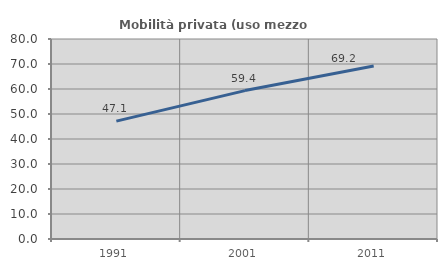
| Category | Mobilità privata (uso mezzo privato) |
|---|---|
| 1991.0 | 47.147 |
| 2001.0 | 59.363 |
| 2011.0 | 69.219 |